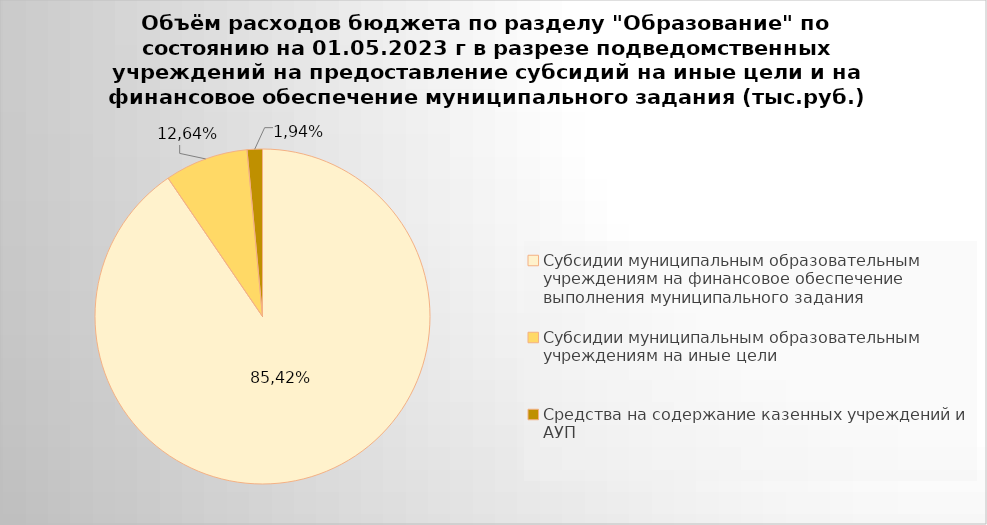
| Category | Series 0 |
|---|---|
| Субсидии муниципальным образовательным учреждениям на финансовое обеспечение выполнения муниципального задания | 7942694.32 |
| Субсидии муниципальным образовательным учреждениям на иные цели | 707311.85 |
| Средства на содержание казенных учреждений и АУП | 129747.54 |